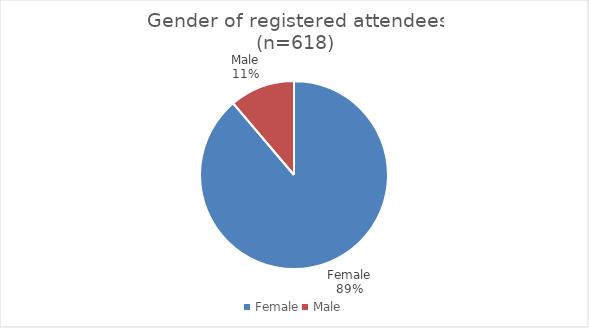
| Category | Series 0 |
|---|---|
| Female | 88.8 |
| Male | 11.2 |